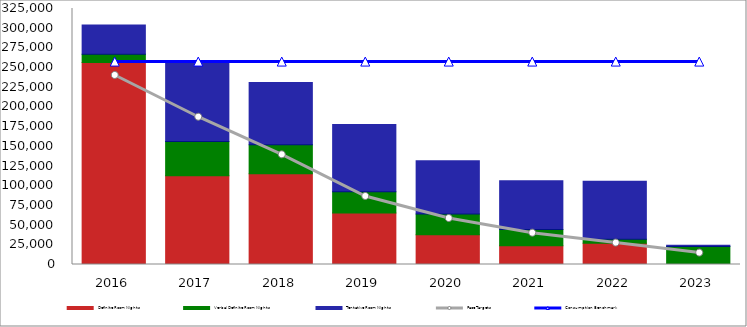
| Category | Definite Room Nights | Verbal Definite Room Nights | Tentative Room Nights |
|---|---|---|---|
| 2016.0 | 256490 | 10317 | 37264 |
| 2017.0 | 112766 | 43272 | 100229 |
| 2018.0 | 115189 | 36685 | 79094 |
| 2019.0 | 65420 | 26814 | 85439 |
| 2020.0 | 37701 | 26445 | 67485 |
| 2021.0 | 23925 | 20387 | 61872 |
| 2022.0 | 27014 | 5000 | 73729 |
| 2023.0 | 0 | 22743 | 1750 |